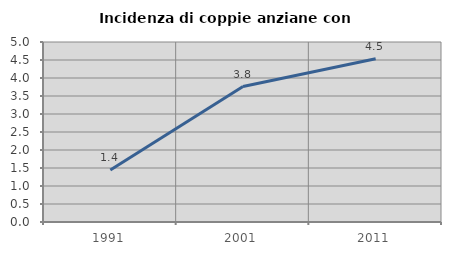
| Category | Incidenza di coppie anziane con figli |
|---|---|
| 1991.0 | 1.443 |
| 2001.0 | 3.763 |
| 2011.0 | 4.533 |